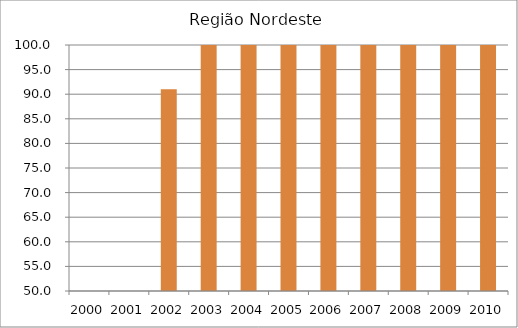
| Category | Região Nordeste |
|---|---|
| 2000.0 | 0 |
| 2001.0 | 0 |
| 2002.0 | 91 |
| 2003.0 | 111.8 |
| 2004.0 | 107.7 |
| 2005.0 | 100.7 |
| 2006.0 | 104.8 |
| 2007.0 | 109.4 |
| 2008.0 | 104.5 |
| 2009.0 | 105.4 |
| 2010.0 | 104.52 |